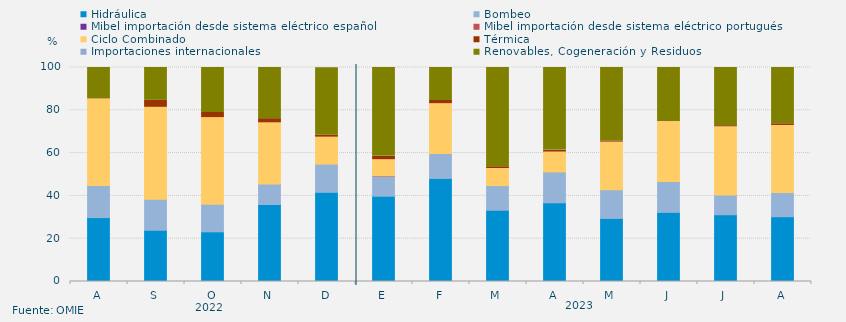
| Category | Hidráulica | Bombeo | Mibel importación desde sistema eléctrico español | Mibel importación desde sistema eléctrico portugués | Ciclo Combinado | Térmica | Importaciones internacionales | Renovables, Cogeneración y Residuos |
|---|---|---|---|---|---|---|---|---|
| A | 29.861 | 14.964 | 0 | 0 | 40.479 | 0.134 | 0 | 14.561 |
| S | 23.935 | 14.514 | 0 | 0 | 42.94 | 3.264 | 0 | 15.347 |
| O | 23.208 | 12.926 | 0 | 0 | 40.457 | 2.419 | 0 | 20.99 |
| N | 35.972 | 9.537 | 0 | 0 | 28.634 | 1.944 | 0 | 23.912 |
| D | 41.662 | 13.19 | 0 | 0 | 12.59 | 0.914 | 0 | 31.537 |
| E | 39.852 | 9.42 | 0 | 0.134 | 7.493 | 1.703 | 0 | 41.398 |
| F | 48.165 | 11.657 | 0 | 0 | 23.264 | 1.488 | 0 | 15.427 |
| M | 33.3 | 11.519 | 0 | 0 | 7.974 | 0.83 | 0 | 46.377 |
| A | 36.771 | 14.433 | 0 | 0 | 9.271 | 0.88 | 0.069 | 38.576 |
| M | 29.48 | 13.418 | 0 | 0 | 22.222 | 0.538 | 0 | 34.341 |
| J | 32.303 | 14.468 | 0 | 0 | 27.905 | 0.035 | 0 | 25.289 |
| J | 31.194 | 9.218 | 0 | 0 | 31.888 | 0.515 | 0 | 27.184 |
| A | 30.276 | 11.279 | 0 | 0 | 31.362 | 0.795 | 0 | 26.288 |